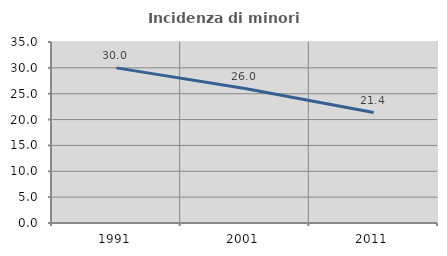
| Category | Incidenza di minori stranieri |
|---|---|
| 1991.0 | 30 |
| 2001.0 | 26 |
| 2011.0 | 21.359 |